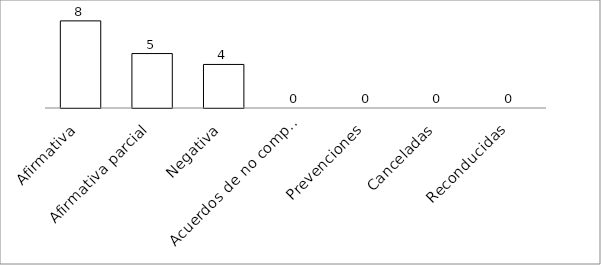
| Category | Series 0 |
|---|---|
| Afirmativa | 8 |
| Afirmativa parcial | 5 |
| Negativa | 4 |
| Acuerdos de no competencia | 0 |
| Prevenciones | 0 |
| Canceladas | 0 |
| Reconducidas | 0 |